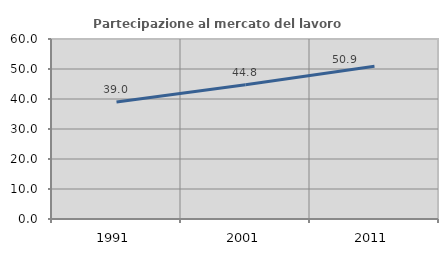
| Category | Partecipazione al mercato del lavoro  femminile |
|---|---|
| 1991.0 | 39.006 |
| 2001.0 | 44.776 |
| 2011.0 | 50.883 |